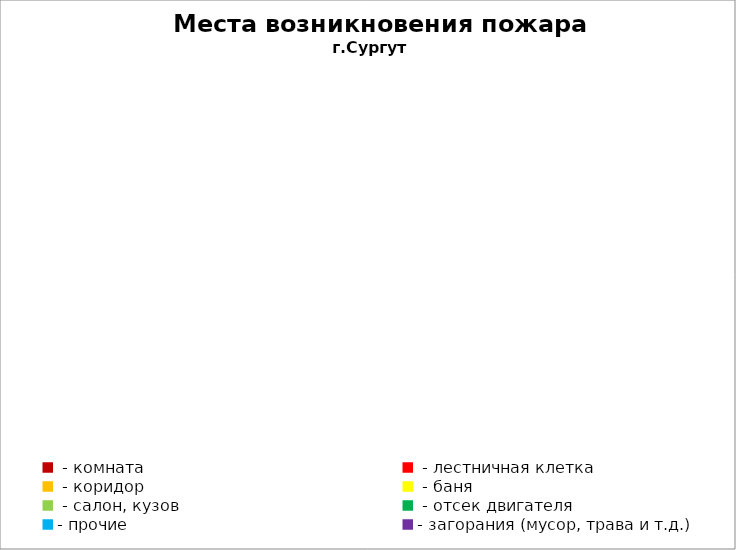
| Category | Места возникновения пожара |
|---|---|
|  - комната | 36 |
|  - лестничная клетка | 8 |
|  - коридор | 7 |
|  - баня | 15 |
|  - салон, кузов | 21 |
|  - отсек двигателя | 33 |
| - прочие | 118 |
| - загорания (мусор, трава и т.д.)  | 94 |